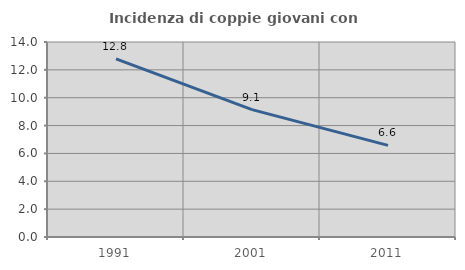
| Category | Incidenza di coppie giovani con figli |
|---|---|
| 1991.0 | 12.787 |
| 2001.0 | 9.145 |
| 2011.0 | 6.577 |